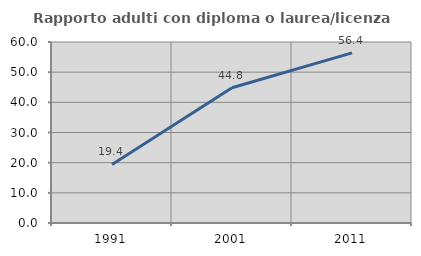
| Category | Rapporto adulti con diploma o laurea/licenza media  |
|---|---|
| 1991.0 | 19.403 |
| 2001.0 | 44.845 |
| 2011.0 | 56.383 |